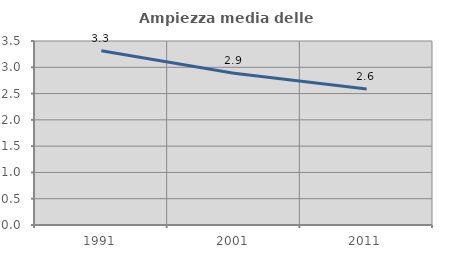
| Category | Ampiezza media delle famiglie |
|---|---|
| 1991.0 | 3.314 |
| 2001.0 | 2.886 |
| 2011.0 | 2.587 |